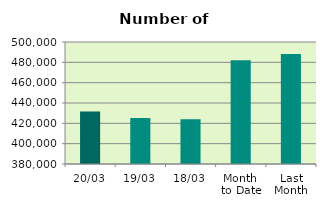
| Category | Series 0 |
|---|---|
| 20/03 | 431572 |
| 19/03 | 425272 |
| 18/03 | 424112 |
| Month 
to Date | 481940 |
| Last
Month | 488116.6 |